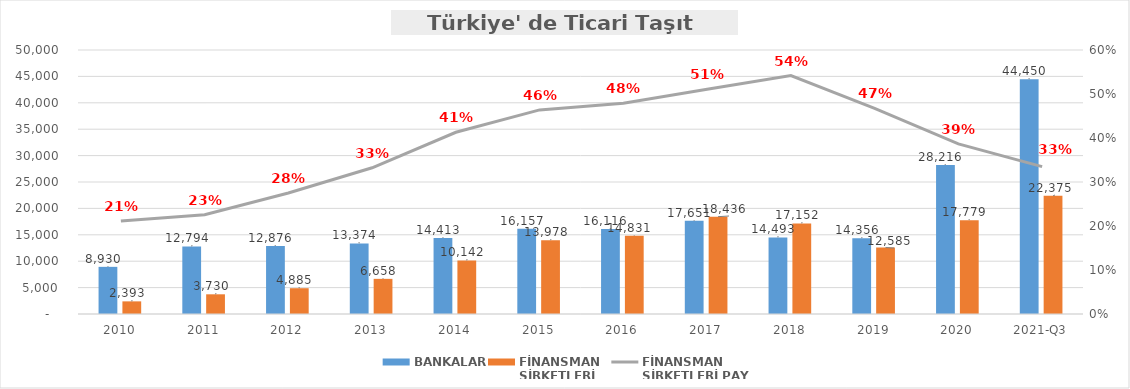
| Category | BANKALAR | FİNANSMAN 
ŞİRKETLERİ |
|---|---|---|
| 2010 | 8930.131 | 2392.721 |
| 2011 | 12793.723 | 3729.987 |
| 2012 | 12876.346 | 4885.495 |
| 2013 | 13374.424 | 6657.806 |
| 2014 | 14412.767 | 10141.887 |
| 2015 | 16157.225 | 13978.426 |
| 2016 | 16116.463 | 14831.249 |
| 2017 | 17650.963 | 18436.034 |
| 2018 | 14492.83 | 17152.034 |
| 2019 | 14355.978 | 12584.792 |
| 2020 | 28216.157 | 17779.072 |
| 2021-Q3 | 44449.855 | 22375.251 |